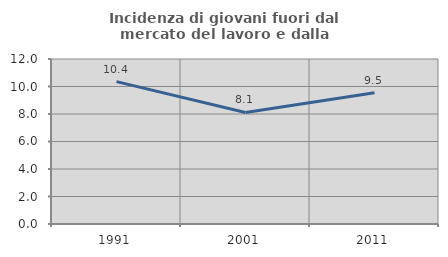
| Category | Incidenza di giovani fuori dal mercato del lavoro e dalla formazione  |
|---|---|
| 1991.0 | 10.356 |
| 2001.0 | 8.111 |
| 2011.0 | 9.546 |